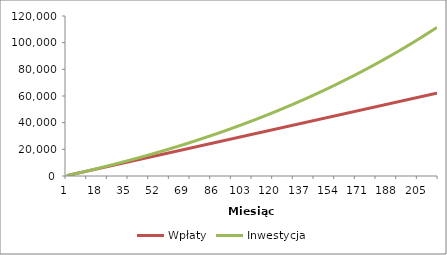
| Category | Wpłaty | Inwestycja |
|---|---|---|
| 0 | 287.901 | 287.901 |
| 1 | 575.801 | 577.241 |
| 2 | 863.702 | 868.027 |
| 3 | 1151.602 | 1160.268 |
| 4 | 1439.503 | 1453.97 |
| 5 | 1727.403 | 1749.14 |
| 6 | 2015.304 | 2045.786 |
| 7 | 2303.204 | 2343.916 |
| 8 | 2591.105 | 2643.536 |
| 9 | 2879.005 | 2944.654 |
| 10 | 3166.906 | 3247.278 |
| 11 | 3454.806 | 3551.415 |
| 12 | 3742.707 | 3857.073 |
| 13 | 4030.608 | 4164.259 |
| 14 | 4318.508 | 4472.98 |
| 15 | 4606.409 | 4783.246 |
| 16 | 4894.309 | 5095.063 |
| 17 | 5182.21 | 5408.438 |
| 18 | 5470.11 | 5723.381 |
| 19 | 5758.011 | 6039.899 |
| 20 | 6045.911 | 6357.999 |
| 21 | 6333.812 | 6677.689 |
| 22 | 6621.712 | 6998.978 |
| 23 | 6909.613 | 7321.874 |
| 24 | 7197.513 | 7646.383 |
| 25 | 7485.414 | 7972.516 |
| 26 | 7773.314 | 8300.279 |
| 27 | 8061.215 | 8629.681 |
| 28 | 8349.116 | 8960.73 |
| 29 | 8637.016 | 9293.434 |
| 30 | 8924.917 | 9627.802 |
| 31 | 9212.817 | 9963.841 |
| 32 | 9500.718 | 10301.561 |
| 33 | 9788.618 | 10640.969 |
| 34 | 10076.519 | 10982.075 |
| 35 | 10364.419 | 11324.886 |
| 36 | 10652.32 | 11669.411 |
| 37 | 10940.22 | 12015.658 |
| 38 | 11228.121 | 12363.637 |
| 39 | 11516.021 | 12713.356 |
| 40 | 11803.922 | 13064.823 |
| 41 | 12091.823 | 13418.048 |
| 42 | 12379.723 | 13773.039 |
| 43 | 12667.624 | 14129.804 |
| 44 | 12955.524 | 14488.354 |
| 45 | 13243.425 | 14848.696 |
| 46 | 13531.325 | 15210.84 |
| 47 | 13819.226 | 15574.795 |
| 48 | 14107.126 | 15940.569 |
| 49 | 14395.027 | 16308.173 |
| 50 | 14682.927 | 16677.614 |
| 51 | 14970.828 | 17048.903 |
| 52 | 15258.728 | 17422.048 |
| 53 | 15546.629 | 17797.059 |
| 54 | 15834.529 | 18173.944 |
| 55 | 16122.43 | 18552.715 |
| 56 | 16410.331 | 18933.379 |
| 57 | 16698.231 | 19315.946 |
| 58 | 16986.132 | 19700.426 |
| 59 | 17274.032 | 20086.829 |
| 60 | 17561.933 | 20475.164 |
| 61 | 17849.833 | 20865.44 |
| 62 | 18137.734 | 21257.668 |
| 63 | 18425.634 | 21651.857 |
| 64 | 18713.535 | 22048.017 |
| 65 | 19001.435 | 22446.157 |
| 66 | 19289.336 | 22846.289 |
| 67 | 19577.236 | 23248.421 |
| 68 | 19865.137 | 23652.563 |
| 69 | 20153.038 | 24058.727 |
| 70 | 20440.938 | 24466.921 |
| 71 | 20728.839 | 24877.156 |
| 72 | 21016.739 | 25289.442 |
| 73 | 21304.64 | 25703.79 |
| 74 | 21592.54 | 26120.209 |
| 75 | 21880.441 | 26538.711 |
| 76 | 22168.341 | 26959.305 |
| 77 | 22456.242 | 27382.002 |
| 78 | 22744.142 | 27806.813 |
| 79 | 23032.043 | 28233.747 |
| 80 | 23319.943 | 28662.817 |
| 81 | 23607.844 | 29094.031 |
| 82 | 23895.744 | 29527.402 |
| 83 | 24183.645 | 29962.939 |
| 84 | 24471.546 | 30400.655 |
| 85 | 24759.446 | 30840.558 |
| 86 | 25047.347 | 31282.662 |
| 87 | 25335.247 | 31726.976 |
| 88 | 25623.148 | 32173.511 |
| 89 | 25911.048 | 32622.279 |
| 90 | 26198.949 | 33073.291 |
| 91 | 26486.849 | 33526.558 |
| 92 | 26774.75 | 33982.091 |
| 93 | 27062.65 | 34439.902 |
| 94 | 27350.551 | 34900.002 |
| 95 | 27638.451 | 35362.403 |
| 96 | 27926.352 | 35827.116 |
| 97 | 28214.253 | 36294.152 |
| 98 | 28502.153 | 36763.523 |
| 99 | 28790.054 | 37235.241 |
| 100 | 29077.954 | 37709.318 |
| 101 | 29365.855 | 38185.765 |
| 102 | 29653.755 | 38664.594 |
| 103 | 29941.656 | 39145.818 |
| 104 | 30229.556 | 39629.447 |
| 105 | 30517.457 | 40115.495 |
| 106 | 30805.357 | 40603.973 |
| 107 | 31093.258 | 41094.894 |
| 108 | 31381.158 | 41588.269 |
| 109 | 31669.059 | 42084.11 |
| 110 | 31956.959 | 42582.432 |
| 111 | 32244.86 | 43083.244 |
| 112 | 32532.761 | 43586.561 |
| 113 | 32820.661 | 44092.394 |
| 114 | 33108.562 | 44600.757 |
| 115 | 33396.462 | 45111.661 |
| 116 | 33684.363 | 45625.12 |
| 117 | 33972.263 | 46141.146 |
| 118 | 34260.164 | 46659.752 |
| 119 | 34548.064 | 47180.952 |
| 120 | 34835.965 | 47704.757 |
| 121 | 35123.865 | 48231.181 |
| 122 | 35411.766 | 48760.238 |
| 123 | 35699.666 | 49291.94 |
| 124 | 35987.567 | 49826.3 |
| 125 | 36275.468 | 50363.332 |
| 126 | 36563.368 | 50903.049 |
| 127 | 36851.269 | 51445.465 |
| 128 | 37139.169 | 51990.593 |
| 129 | 37427.07 | 52538.446 |
| 130 | 37714.97 | 53089.039 |
| 131 | 38002.871 | 53642.385 |
| 132 | 38290.771 | 54198.497 |
| 133 | 38578.672 | 54757.39 |
| 134 | 38866.572 | 55319.078 |
| 135 | 39154.473 | 55883.574 |
| 136 | 39442.373 | 56450.892 |
| 137 | 39730.274 | 57021.047 |
| 138 | 40018.174 | 57594.053 |
| 139 | 40306.075 | 58169.923 |
| 140 | 40593.976 | 58748.674 |
| 141 | 40881.876 | 59330.318 |
| 142 | 41169.777 | 59914.87 |
| 143 | 41457.677 | 60502.345 |
| 144 | 41745.578 | 61092.757 |
| 145 | 42033.478 | 61686.121 |
| 146 | 42321.379 | 62282.452 |
| 147 | 42609.279 | 62881.765 |
| 148 | 42897.18 | 63484.074 |
| 149 | 43185.08 | 64089.395 |
| 150 | 43472.981 | 64697.743 |
| 151 | 43760.881 | 65309.132 |
| 152 | 44048.782 | 65923.578 |
| 153 | 44336.683 | 66541.097 |
| 154 | 44624.583 | 67161.703 |
| 155 | 44912.484 | 67785.412 |
| 156 | 45200.384 | 68412.239 |
| 157 | 45488.285 | 69042.201 |
| 158 | 45776.185 | 69675.313 |
| 159 | 46064.086 | 70311.59 |
| 160 | 46351.986 | 70951.048 |
| 161 | 46639.887 | 71593.704 |
| 162 | 46927.787 | 72239.573 |
| 163 | 47215.688 | 72888.671 |
| 164 | 47503.588 | 73541.015 |
| 165 | 47791.489 | 74196.621 |
| 166 | 48079.389 | 74855.505 |
| 167 | 48367.29 | 75517.683 |
| 168 | 48655.191 | 76183.172 |
| 169 | 48943.091 | 76851.988 |
| 170 | 49230.992 | 77524.149 |
| 171 | 49518.892 | 78199.67 |
| 172 | 49806.793 | 78878.569 |
| 173 | 50094.693 | 79560.862 |
| 174 | 50382.594 | 80246.567 |
| 175 | 50670.494 | 80935.7 |
| 176 | 50958.395 | 81628.279 |
| 177 | 51246.295 | 82324.321 |
| 178 | 51534.196 | 83023.843 |
| 179 | 51822.096 | 83726.863 |
| 180 | 52109.997 | 84433.398 |
| 181 | 52397.898 | 85143.466 |
| 182 | 52685.798 | 85857.083 |
| 183 | 52973.699 | 86574.269 |
| 184 | 53261.599 | 87295.041 |
| 185 | 53549.5 | 88019.417 |
| 186 | 53837.4 | 88747.415 |
| 187 | 54125.301 | 89479.052 |
| 188 | 54413.201 | 90214.348 |
| 189 | 54701.102 | 90953.32 |
| 190 | 54989.002 | 91695.987 |
| 191 | 55276.903 | 92442.368 |
| 192 | 55564.803 | 93192.48 |
| 193 | 55852.704 | 93946.343 |
| 194 | 56140.604 | 94703.975 |
| 195 | 56428.505 | 95465.396 |
| 196 | 56716.406 | 96230.623 |
| 197 | 57004.306 | 96999.677 |
| 198 | 57292.207 | 97772.576 |
| 199 | 57580.107 | 98549.339 |
| 200 | 57868.008 | 99329.987 |
| 201 | 58155.908 | 100114.537 |
| 202 | 58443.809 | 100903.01 |
| 203 | 58731.709 | 101695.426 |
| 204 | 59019.61 | 102491.804 |
| 205 | 59307.51 | 103292.163 |
| 206 | 59595.411 | 104096.524 |
| 207 | 59883.311 | 104904.908 |
| 208 | 60171.212 | 105717.333 |
| 209 | 60459.113 | 106533.82 |
| 210 | 60747.013 | 107354.389 |
| 211 | 61034.914 | 108179.062 |
| 212 | 61322.814 | 109007.858 |
| 213 | 61610.715 | 109840.798 |
| 214 | 61898.615 | 110677.902 |
| 215 | 62186.516 | 111519.192 |